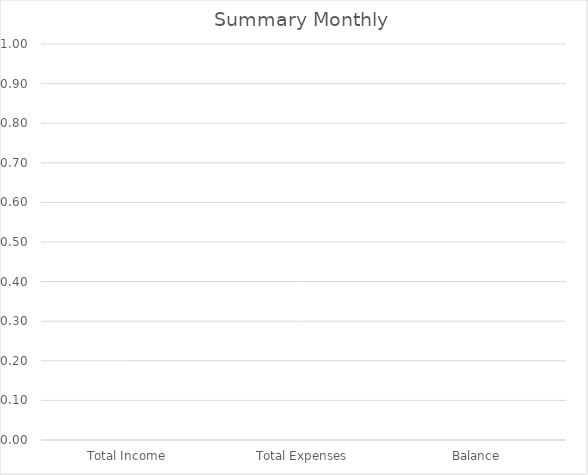
| Category | Monthly |
|---|---|
| Total Income | 0 |
| Total Expenses | 0 |
| Balance | 0 |